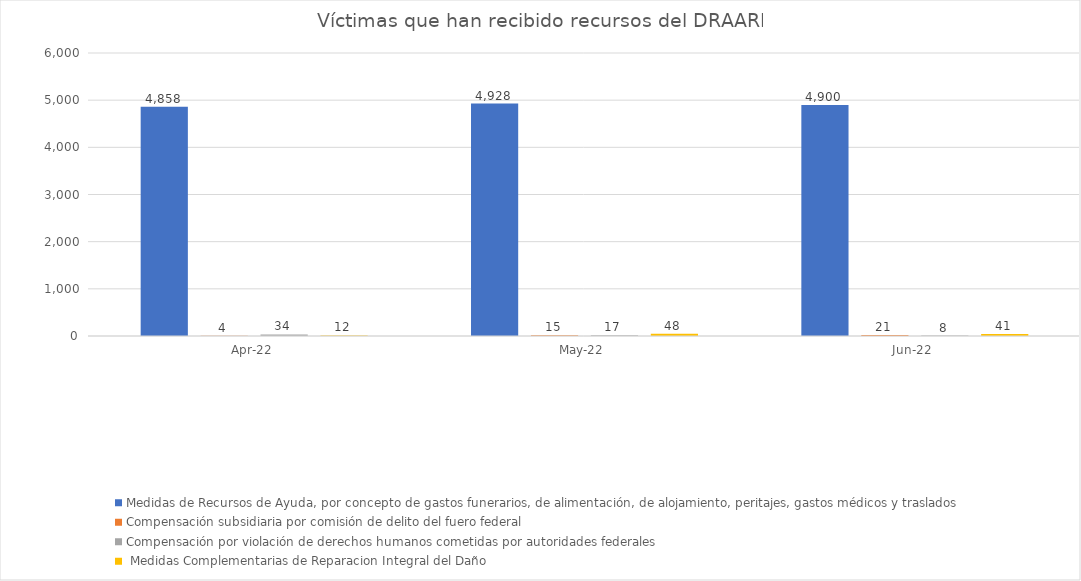
| Category | Medidas de Recursos de Ayuda, por concepto de gastos funerarios, de alimentación, de alojamiento, peritajes, gastos médicos y traslados | Compensación subsidiaria por comisión de delito del fuero federal | Compensación por violación de derechos humanos cometidas por autoridades federales |  Medidas Complementarias de Reparacion Integral del Daño |
|---|---|---|---|---|
| 2022-04-01 | 4858 | 4 | 34 | 12 |
| 2022-05-01 | 4928 | 15 | 17 | 48 |
| 2022-06-01 | 4900 | 21 | 8 | 41 |